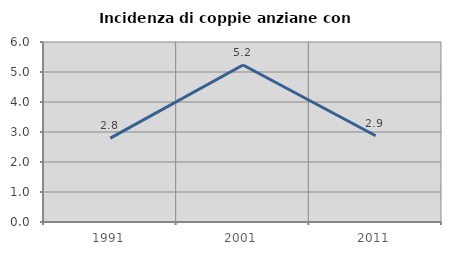
| Category | Incidenza di coppie anziane con figli |
|---|---|
| 1991.0 | 2.797 |
| 2001.0 | 5.234 |
| 2011.0 | 2.875 |